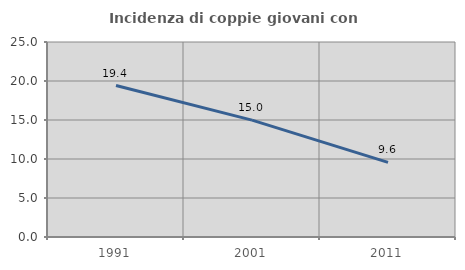
| Category | Incidenza di coppie giovani con figli |
|---|---|
| 1991.0 | 19.421 |
| 2001.0 | 14.981 |
| 2011.0 | 9.562 |